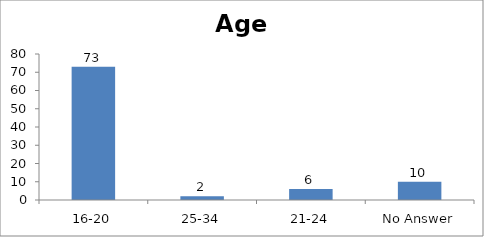
| Category | Age |
|---|---|
| 16-20 | 73 |
| 25-34 | 2 |
| 21-24 | 6 |
| No Answer | 10 |